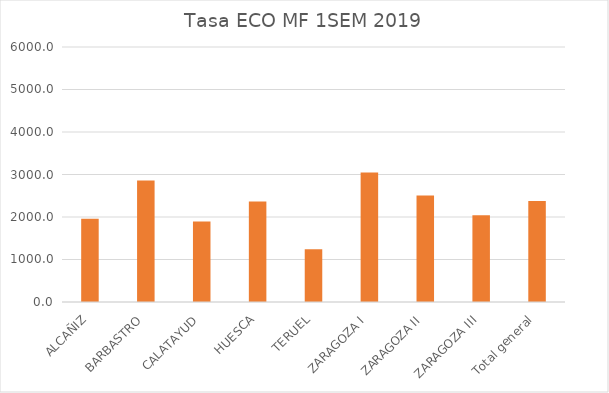
| Category | 1sem2019 |
|---|---|
| ALCAÑIZ | 1961.14 |
| BARBASTRO | 2861.704 |
| CALATAYUD | 1896.474 |
| HUESCA | 2362.146 |
| TERUEL | 1244.093 |
| ZARAGOZA I | 3046.234 |
| ZARAGOZA II | 2508.441 |
| ZARAGOZA III | 2042.982 |
| Total general | 2374.366 |